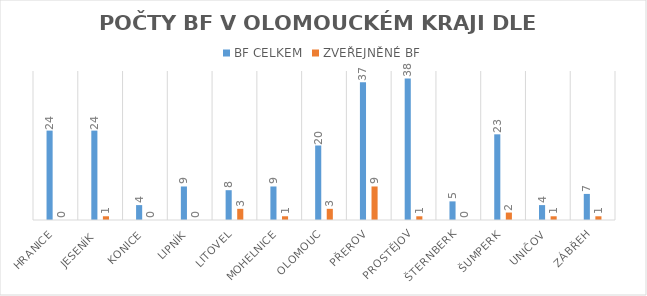
| Category | BF CELKEM | ZVEŘEJNĚNÉ BF |
|---|---|---|
| HRANICE | 24 | 0 |
| JESENÍK  | 24 | 1 |
| KONICE | 4 | 0 |
| LIPNÍK | 9 | 0 |
| LITOVEL | 8 | 3 |
| MOHELNICE | 9 | 1 |
| OLOMOUC | 20 | 3 |
| PŘEROV | 37 | 9 |
| PROSTĚJOV | 38 | 1 |
| ŠTERNBERK | 5 | 0 |
| ŠUMPERK | 23 | 2 |
| UNIČOV | 4 | 1 |
| ZÁBŘEH | 7 | 1 |